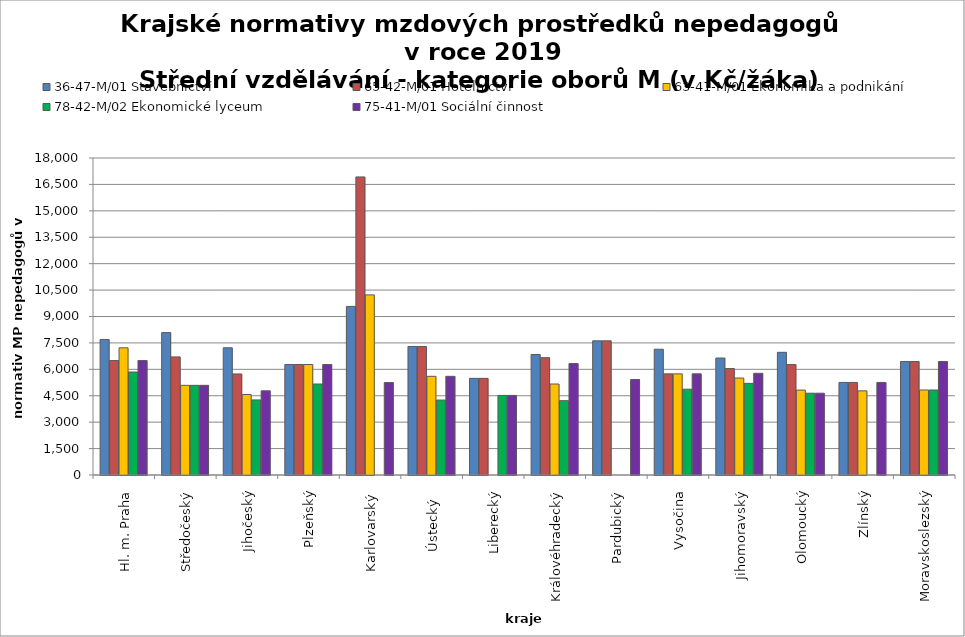
| Category | 36-47-M/01 Stavebnictví | 65-42-M/01 Hotelnictví | 63-41-M/01 Ekonomika a podnikání | 78-42-M/02 Ekonomické lyceum | 75-41-M/01 Sociální činnost |
|---|---|---|---|---|---|
| Hl. m. Praha | 7695.789 | 6498.667 | 7220.741 | 5848.8 | 6498.667 |
| Středočeský | 8086.941 | 6706.244 | 5091.778 | 5091.778 | 5091.778 |
| Jihočeský | 7223.314 | 5738.106 | 4569.631 | 4262.746 | 4779.988 |
| Plzeňský | 6274.286 | 6274.286 | 6274.286 | 5167.059 | 6274.286 |
| Karlovarský  | 9573.46 | 16925.01 | 10227.848 | 0 | 5249.026 |
| Ústecký   | 7298.036 | 7298.036 | 5603.256 | 4255.418 | 5603.256 |
| Liberecký | 5488.154 | 5488.154 | 0 | 4519.364 | 4519.364 |
| Královéhradecký | 6842.485 | 6663.315 | 5166.944 | 4220.1 | 6330.149 |
| Pardubický | 7618.378 | 7618.378 | 0 | 0 | 5420.769 |
| Vysočina | 7141.48 | 5742.799 | 5742.799 | 4872.046 | 5742.799 |
| Jihomoravský | 6642.899 | 6044.308 | 5505.826 | 5202.724 | 5774.008 |
| Olomoucký | 6965.837 | 6269.254 | 4822.503 | 4643.892 | 4643.892 |
| Zlínský | 5256 | 5256 | 4778.182 | 0 | 5256 |
| Moravskoslezský | 6445.059 | 6445.059 | 4827.119 | 4827.119 | 6445.059 |